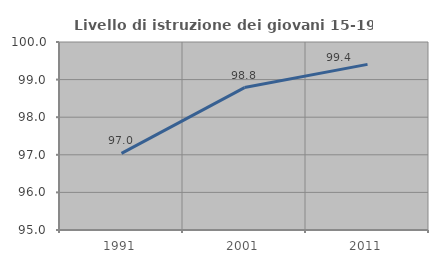
| Category | Livello di istruzione dei giovani 15-19 anni |
|---|---|
| 1991.0 | 97.037 |
| 2001.0 | 98.788 |
| 2011.0 | 99.405 |